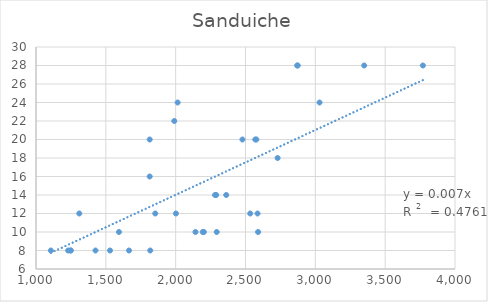
| Category | Sanduiche |
|---|---|
| 2202.0 | 10 |
| 1310.0 | 12 |
| 2194.0 | 10 |
| 1106.0 | 8 |
| 1814.0 | 20 |
| 2002.0 | 12 |
| 2362.0 | 14 |
| 1230.0 | 8 |
| 2586.0 | 12 |
| 1854.0 | 12 |
| 2534.0 | 12 |
| 2570.0 | 20 |
| 1246.0 | 8 |
| 1990.0 | 22 |
| 1594.0 | 10 |
| 2578.0 | 20 |
| 1530.0 | 8 |
| 2478.0 | 20 |
| 1666.0 | 8 |
| 2282.0 | 14 |
| 2142.0 | 10 |
| 3030.0 | 24 |
| 2590.0 | 10 |
| 2874.0 | 28 |
| 2014.0 | 24 |
| 3350.0 | 28 |
| 1250.0 | 8 |
| 2870.0 | 28 |
| 1814.0 | 16 |
| 3770.0 | 28 |
| 2294.0 | 10 |
| 2730.0 | 18 |
| 2290.0 | 14 |
| 1818.0 | 8 |
| 1426.0 | 8 |